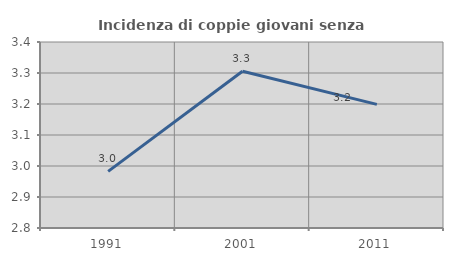
| Category | Incidenza di coppie giovani senza figli |
|---|---|
| 1991.0 | 2.983 |
| 2001.0 | 3.306 |
| 2011.0 | 3.199 |